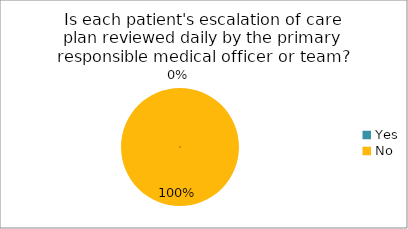
| Category | Is each patient's escalation of care plan reviewed daily by the primary responsible medical officer or team? |
|---|---|
| Yes | 0 |
| No | 1 |